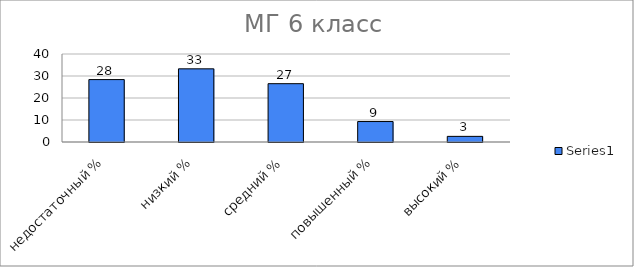
| Category | Series 0 |
|---|---|
| недостаточный % | 28.372 |
| низкий % | 33.256 |
| средний % | 26.512 |
| повышенный % | 9.302 |
| высокий % | 2.558 |